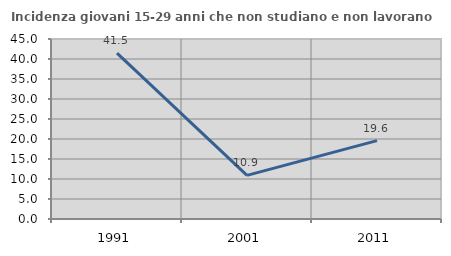
| Category | Incidenza giovani 15-29 anni che non studiano e non lavorano  |
|---|---|
| 1991.0 | 41.487 |
| 2001.0 | 10.909 |
| 2011.0 | 19.585 |